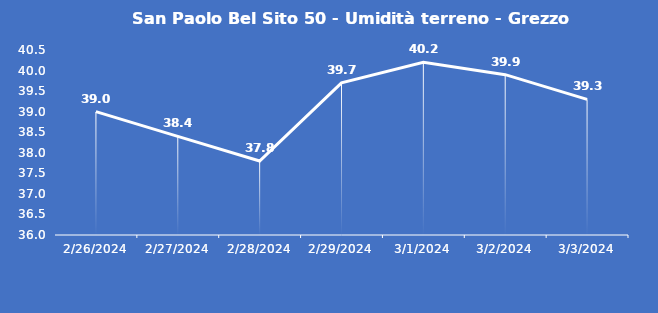
| Category | San Paolo Bel Sito 50 - Umidità terreno - Grezzo (%VWC) |
|---|---|
| 2/26/24 | 39 |
| 2/27/24 | 38.4 |
| 2/28/24 | 37.8 |
| 2/29/24 | 39.7 |
| 3/1/24 | 40.2 |
| 3/2/24 | 39.9 |
| 3/3/24 | 39.3 |